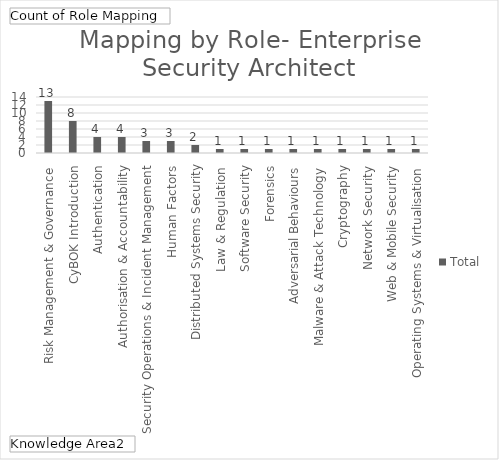
| Category | Total |
|---|---|
| Risk Management & Governance | 13 |
| CyBOK Introduction | 8 |
| Authentication, Authorisation & Accountability | 4 |
| Security Operations & Incident Management | 4 |
| Human Factors | 3 |
| Distributed Systems Security | 3 |
| Law & Regulation | 2 |
| Software Security | 1 |
| Forensics | 1 |
| Adversarial Behaviours | 1 |
| Malware & Attack Technology | 1 |
| Cryptography | 1 |
| Network Security | 1 |
| Web & Mobile Security | 1 |
| Operating Systems & Virtualisation | 1 |
| Privacy & Online Rights | 1 |